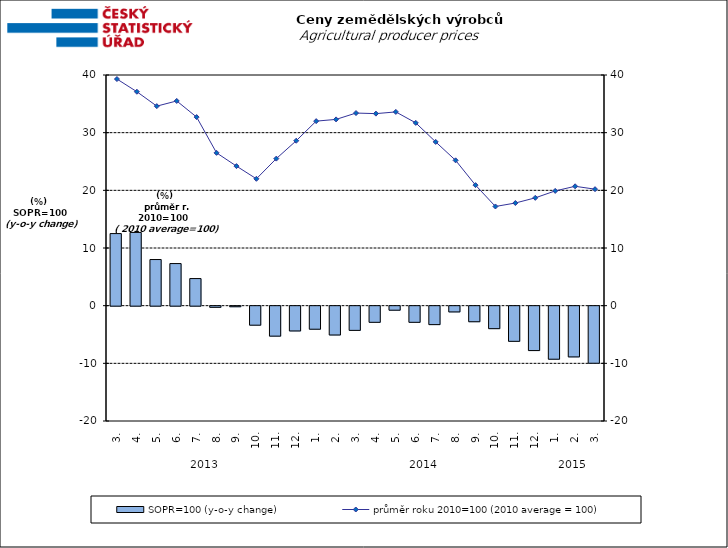
| Category | SOPR=100 (y-o-y change)   |
|---|---|
| 0 | 12.5 |
| 1 | 12.7 |
| 2 | 8 |
| 3 | 7.3 |
| 4 | 4.7 |
| 5 | -0.2 |
| 6 | -0.1 |
| 7 | -3.3 |
| 8 | -5.2 |
| 9 | -4.3 |
| 10 | -4 |
| 11 | -5 |
| 12 | -4.2 |
| 13 | -2.8 |
| 14 | -0.7 |
| 15 | -2.8 |
| 16 | -3.2 |
| 17 | -1 |
| 18 | -2.7 |
| 19 | -3.9 |
| 20 | -6.1 |
| 21 | -7.7 |
| 22 | -9.2 |
| 23 | -8.8 |
| 24 | -9.9 |